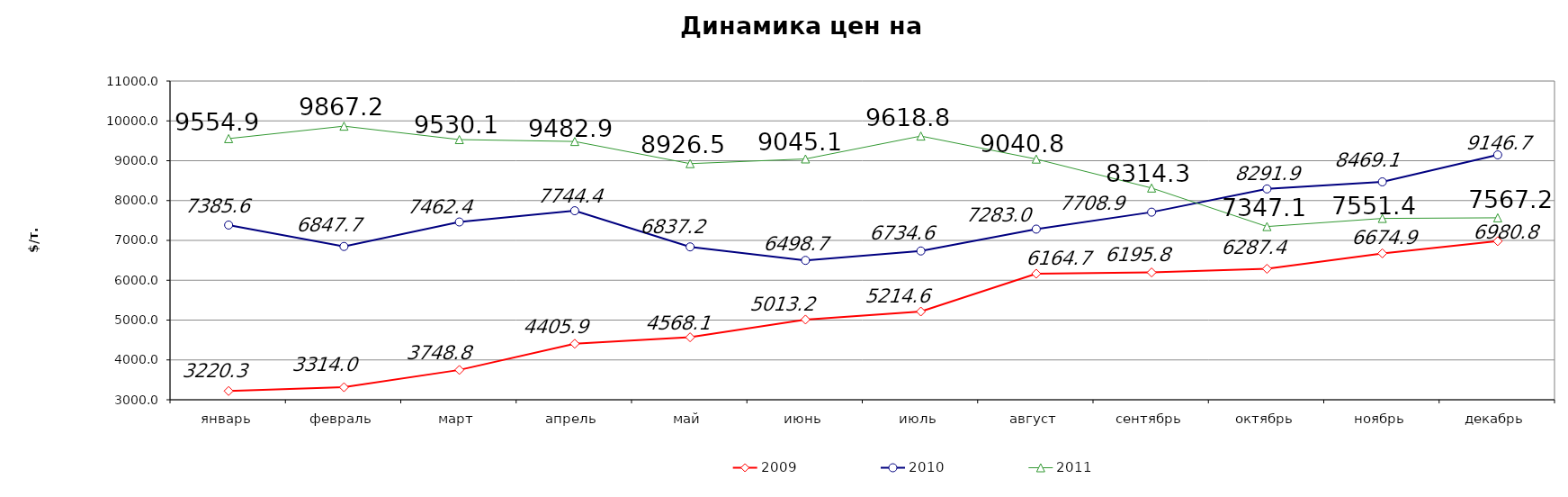
| Category | 2009 | 2010 | 2011 |
|---|---|---|---|
| январь | 3220.274 | 7385.612 | 9554.92 |
| февраль | 3314.038 | 6847.688 | 9867.18 |
| март | 3748.773 | 7462.4 | 9530.11 |
| апрель | 4405.862 | 7744.4 | 9482.91 |
| май | 4568.145 | 6837.2 | 8926.49 |
| июнь | 5013.18 | 6498.66 | 9045.12 |
| июль | 5214.63 | 6734.63 | 9618.8 |
| август | 6164.725 | 7283.04 | 9040.82 |
| сентябрь | 6195.761 | 7708.932 | 8314.33 |
| октябрь | 6287.375 | 8291.85 | 7347.105 |
| ноябрь | 6674.917 | 8469.14 | 7551.361 |
| декабрь | 6980.821 | 9146.67 | 7567.165 |